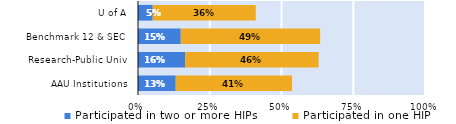
| Category | Participated in two or more HIPs | Participated in one HIP |
|---|---|---|
| AAU Institutions | 0.131 | 0.405 |
| Research-Public Univ | 0.164 | 0.465 |
| Benchmark 12 & SEC | 0.149 | 0.486 |
| U of A | 0.051 | 0.359 |